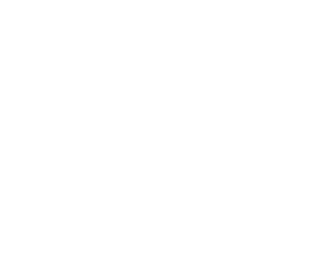
| Category | Series 0 |
|---|---|
| Hogar | 0 |
| Financieros | 0 |
| Transporte | 0 |
| Salud | 0 |
| Educación | 0 |
| Diarios | 0 |
| Otros | 0 |